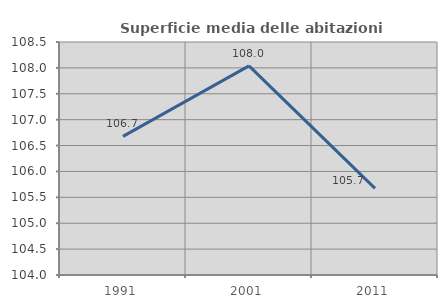
| Category | Superficie media delle abitazioni occupate |
|---|---|
| 1991.0 | 106.677 |
| 2001.0 | 108.039 |
| 2011.0 | 105.673 |